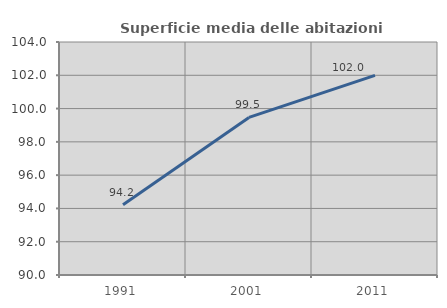
| Category | Superficie media delle abitazioni occupate |
|---|---|
| 1991.0 | 94.221 |
| 2001.0 | 99.468 |
| 2011.0 | 101.99 |